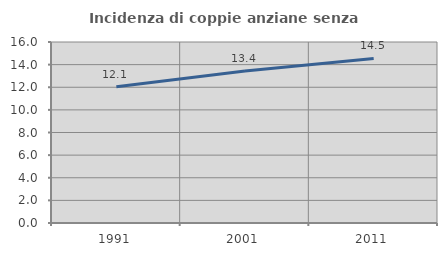
| Category | Incidenza di coppie anziane senza figli  |
|---|---|
| 1991.0 | 12.053 |
| 2001.0 | 13.433 |
| 2011.0 | 14.545 |